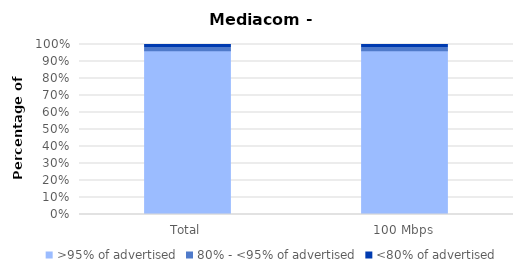
| Category | >95% of advertised | 80% - <95% of advertised | <80% of advertised |
|---|---|---|---|
| Total | 0.964 | 0.018 | 0.018 |
| 100 Mbps | 0.964 | 0.018 | 0.018 |